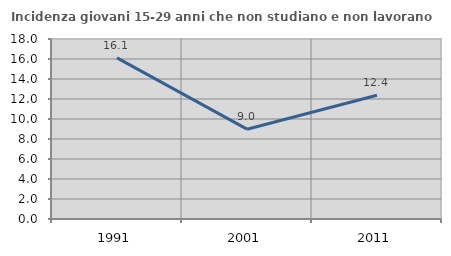
| Category | Incidenza giovani 15-29 anni che non studiano e non lavorano  |
|---|---|
| 1991.0 | 16.118 |
| 2001.0 | 8.982 |
| 2011.0 | 12.381 |